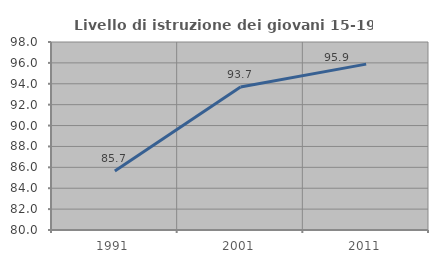
| Category | Livello di istruzione dei giovani 15-19 anni |
|---|---|
| 1991.0 | 85.658 |
| 2001.0 | 93.698 |
| 2011.0 | 95.88 |